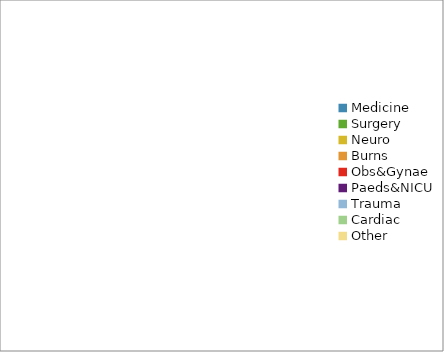
| Category | Series 0 |
|---|---|
| Medicine | 0 |
| Surgery | 0 |
| Neuro | 0 |
| Burns | 0 |
| Obs&Gynae | 0 |
| Paeds&NICU | 0 |
| Trauma | 0 |
| Cardiac | 0 |
| Other | 0 |